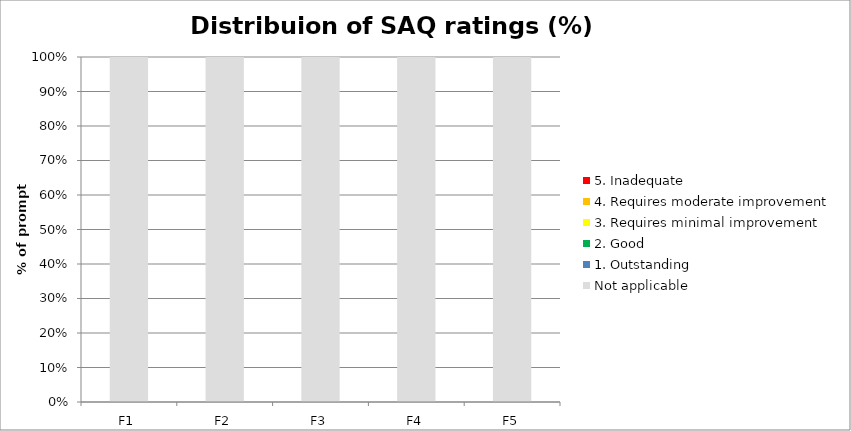
| Category | Not applicable | 1. Outstanding | 2. Good | 3. Requires minimal improvement | 4. Requires moderate improvement | 5. Inadequate |
|---|---|---|---|---|---|---|
| F1 | 1 | 0 | 0 | 0 | 0 | 0 |
| F2 | 1 | 0 | 0 | 0 | 0 | 0 |
| F3 | 1 | 0 | 0 | 0 | 0 | 0 |
| F4 | 1 | 0 | 0 | 0 | 0 | 0 |
| F5 | 1 | 0 | 0 | 0 | 0 | 0 |